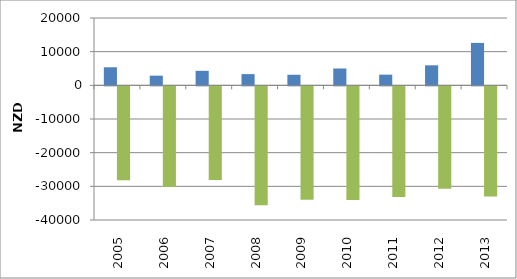
| Category | Series 0 | Import of Food and Live animals |
|---|---|---|
| 2005.0 | 5366 | -27866 |
| 2006.0 | 2872 | -29914 |
| 2007.0 | 4309 | -27797 |
| 2008.0 | 3336 | -35316 |
| 2009.0 | 3139 | -33725 |
| 2010.0 | 5007 | -33745 |
| 2011.0 | 3171 | -32873 |
| 2012.0 | 5946 | -30442 |
| 2013.0 | 12601 | -32756 |